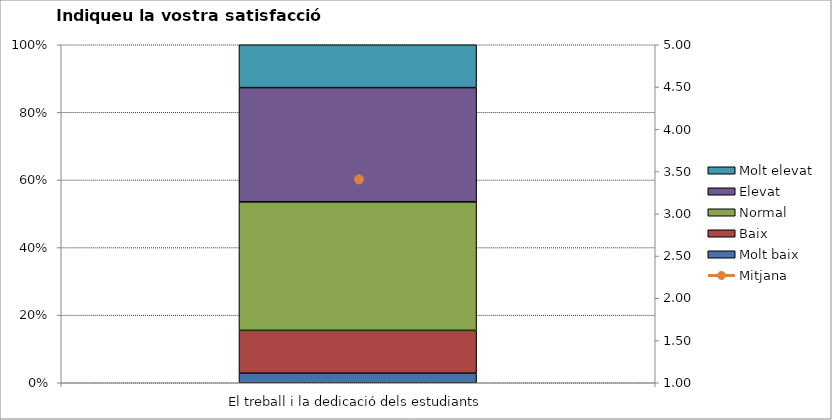
| Category | Molt baix | Baix | Normal  | Elevat | Molt elevat |
|---|---|---|---|---|---|
| El treball i la dedicació dels estudiants | 2 | 9 | 27 | 24 | 9 |